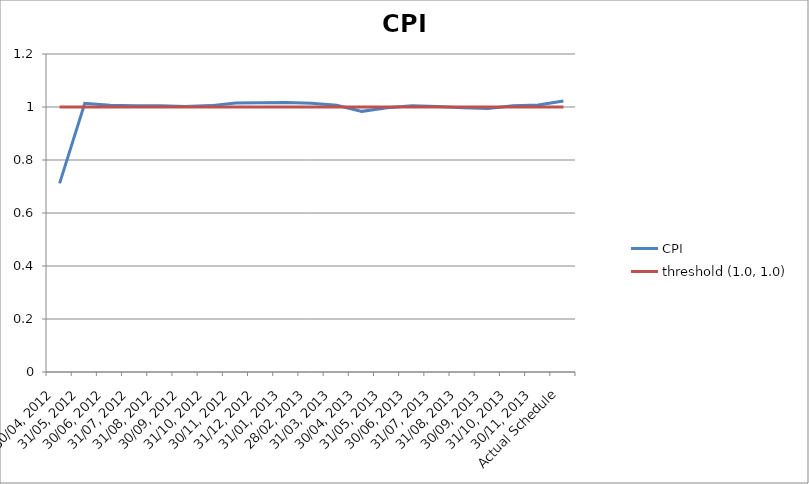
| Category | CPI | threshold (1.0, 1.0) |
|---|---|---|
| 30/04, 2012 | 0.712 | 1 |
| 31/05, 2012 | 1.014 | 1 |
| 30/06, 2012 | 1.006 | 1 |
| 31/07, 2012 | 1.005 | 1 |
| 31/08, 2012 | 1.005 | 1 |
| 30/09, 2012 | 1.002 | 1 |
| 31/10, 2012 | 1.005 | 1 |
| 30/11, 2012 | 1.015 | 1 |
| 31/12, 2012 | 1.016 | 1 |
| 31/01, 2013 | 1.017 | 1 |
| 28/02, 2013 | 1.014 | 1 |
| 31/03, 2013 | 1.007 | 1 |
| 30/04, 2013 | 0.984 | 1 |
| 31/05, 2013 | 0.997 | 1 |
| 30/06, 2013 | 1.005 | 1 |
| 31/07, 2013 | 1.002 | 1 |
| 31/08, 2013 | 0.997 | 1 |
| 30/09, 2013 | 0.995 | 1 |
| 31/10, 2013 | 1.005 | 1 |
| 30/11, 2013 | 1.007 | 1 |
| Actual Schedule | 1.022 | 1 |